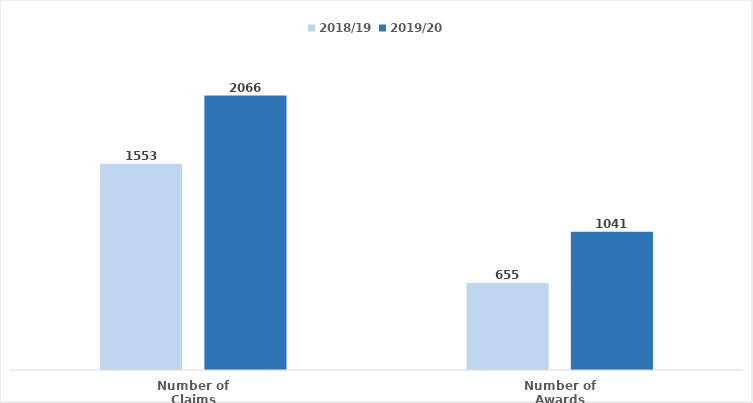
| Category | 2018/19 | 2019/20 |
|---|---|---|
| Number of Claims | 1552.85 | 2066.4 |
| Number of Awards | 655.2 | 1041 |